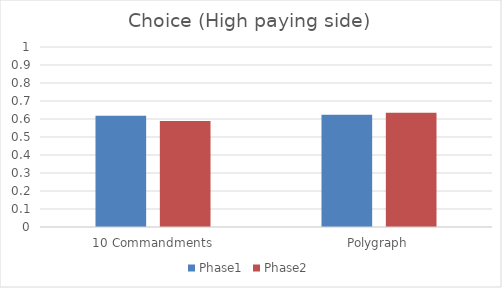
| Category | Phase1 | Phase2 |
|---|---|---|
| 10 Commandments | 0.618 | 0.59 |
| Polygraph | 0.624 | 0.635 |